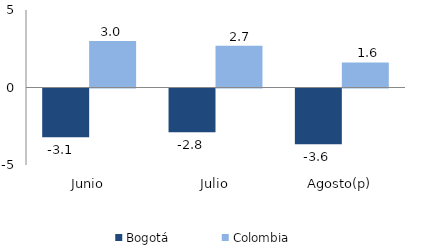
| Category | Bogotá | Colombia |
|---|---|---|
| Junio | -3.146 | 3.004 |
| Julio | -2.823 | 2.693 |
| Agosto(p) | -3.6 | 1.613 |